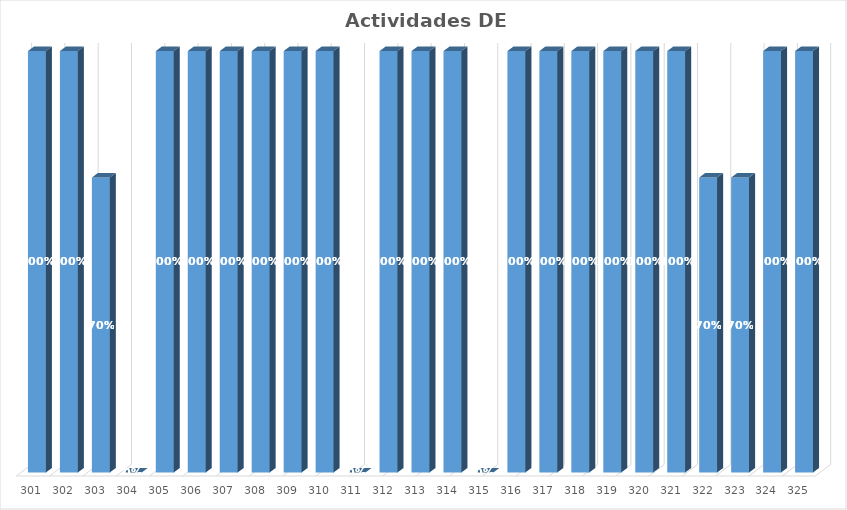
| Category | % Avance |
|---|---|
| 301.0 | 1 |
| 302.0 | 1 |
| 303.0 | 0.7 |
| 304.0 | 0 |
| 305.0 | 1 |
| 306.0 | 1 |
| 307.0 | 1 |
| 308.0 | 1 |
| 309.0 | 1 |
| 310.0 | 1 |
| 311.0 | 0 |
| 312.0 | 1 |
| 313.0 | 1 |
| 314.0 | 1 |
| 315.0 | 0 |
| 316.0 | 1 |
| 317.0 | 1 |
| 318.0 | 1 |
| 319.0 | 1 |
| 320.0 | 1 |
| 321.0 | 1 |
| 322.0 | 0.7 |
| 323.0 | 0.7 |
| 324.0 | 1 |
| 325.0 | 1 |